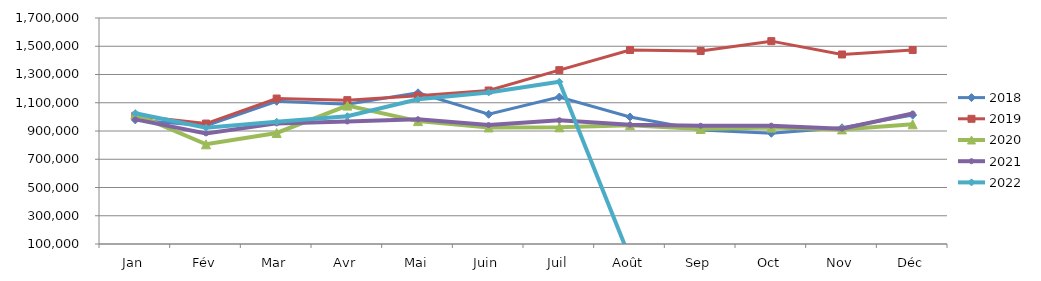
| Category | 2018 | 2019 | 2020 | 2021 | 2022 |
|---|---|---|---|---|---|
| Jan | 978468.279 | 1007982.373 | 1019103.465 | 982555.093 | 1025150.28 |
| Fév | 937137.209 | 952616.766 | 805837.355 | 883272.289 | 923686.154 |
| Mar | 1110199.711 | 1129815.679 | 886115.696 | 953969.676 | 965816.099 |
| Avr | 1090229.308 | 1118398.221 | 1079723.465 | 967473.972 | 1004850.977 |
| Mai | 1170512.154 | 1150217.455 | 970040.088 | 982779.252 | 1124147.093 |
| Juin | 1018295.812 | 1186623.687 | 925406.896 | 941931.836 | 1173312.725 |
| Juil | 1140133.118 | 1330812.699 | 926286.755 | 976002.038 | 1248471.51 |
| Août | 999343.146 | 1473280.035 | 941195.84 | 944349.197 | 0 |
| Sep | 907808.882 | 1466448.158 | 914678.196 | 937034.569 | 0 |
| Oct | 883825.979 | 1536100.268 | 923984.732 | 937856.38 | 0 |
| Nov | 922678.039 | 1441770.199 | 911296.416 | 916487.725 | 0 |
| Déc | 1012620.724 | 1473565.92 | 947568.113 | 1024000.752 | 0 |